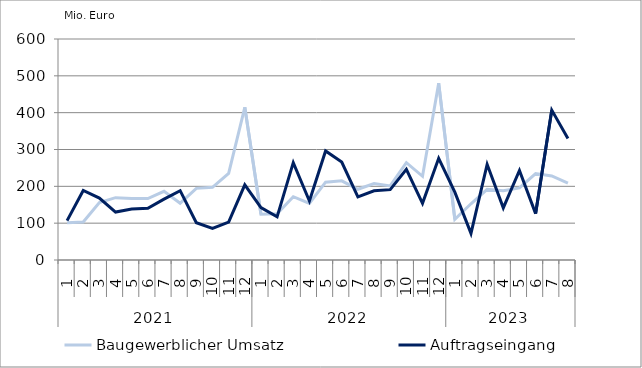
| Category | Baugewerblicher Umsatz | Auftragseingang |
|---|---|---|
| 0 | 101295.895 | 106850.127 |
| 1 | 103236.543 | 188883.434 |
| 2 | 156172.725 | 168204.42 |
| 3 | 169257.088 | 130052.073 |
| 4 | 166897.821 | 138492.214 |
| 5 | 166720.216 | 140262.426 |
| 6 | 186515.191 | 165331.191 |
| 7 | 154188.941 | 188169.655 |
| 8 | 194464.12 | 101359.538 |
| 9 | 197281.201 | 85626.862 |
| 10 | 235325.083 | 102880.924 |
| 11 | 414469.471 | 203900.676 |
| 12 | 124217.549 | 142351.759 |
| 13 | 125619.696 | 117194.423 |
| 14 | 171896.664 | 264509.013 |
| 15 | 153384.654 | 160146.519 |
| 16 | 211335.38 | 295997.826 |
| 17 | 214914.164 | 265813.917 |
| 18 | 192047.613 | 171529.517 |
| 19 | 207577.681 | 187809.656 |
| 20 | 201109.781 | 190941.096 |
| 21 | 264135.048 | 246250.021 |
| 22 | 227299.047 | 153783.993 |
| 23 | 480026.589 | 276019.328 |
| 24 | 110408.991 | 184068.731 |
| 25 | 152702.87 | 72330.186 |
| 26 | 191677.032 | 259741.102 |
| 27 | 187876.702 | 141464.389 |
| 28 | 195815.34 | 243069.898 |
| 29 | 234759.067 | 125882.939 |
| 30 | 228043.08 | 406932.293 |
| 31 | 208510.786 | 330128.024 |